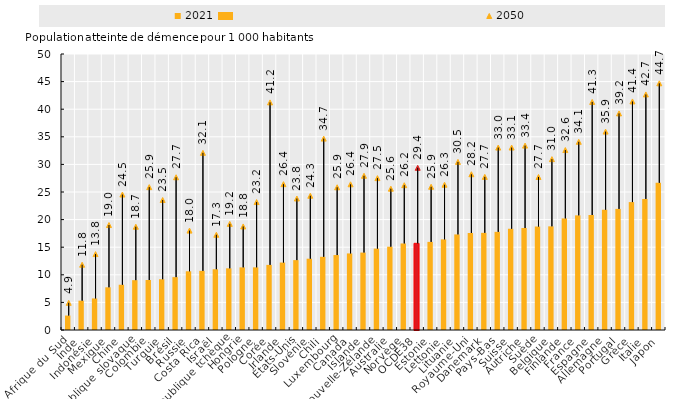
| Category | 2021 |
|---|---|
| Afrique du Sud | 2.619 |
| Inde | 5.316 |
| Indonésie | 5.72 |
| Mexique | 7.736 |
| Chine | 8.202 |
| République slovaque | 9.03 |
| Colombie | 9.063 |
| Turquie | 9.195 |
| Brésil | 9.576 |
| Russie | 10.638 |
| Costa Rica | 10.716 |
| Israël | 11.011 |
| République tchèque | 11.172 |
| Hongrie | 11.346 |
| Pologne | 11.351 |
| Corée | 11.797 |
| Irlande | 12.223 |
| États-Unis | 12.662 |
| Slovénie | 12.916 |
| Chili | 13.263 |
| Luxembourg | 13.578 |
| Canada | 13.872 |
| Islande | 14.03 |
| Nouvelle-Zélande | 14.745 |
| Australie | 15.095 |
| Norvège | 15.677 |
| OCDE38 | 15.7 |
| Estonie | 15.964 |
| Lettonie | 16.419 |
| Lituanie | 17.317 |
| Royaume-Uni | 17.575 |
| Danemark | 17.602 |
| Pays-Bas | 17.782 |
| Suisse | 18.342 |
| Autriche | 18.475 |
| Suède | 18.746 |
| Belgique | 18.778 |
| Finlande | 20.217 |
| France | 20.769 |
| Espagne | 20.839 |
| Allemagne | 21.789 |
| Portugal | 21.937 |
| Grèce | 23.172 |
| Italie | 23.745 |
| Japon | 26.665 |